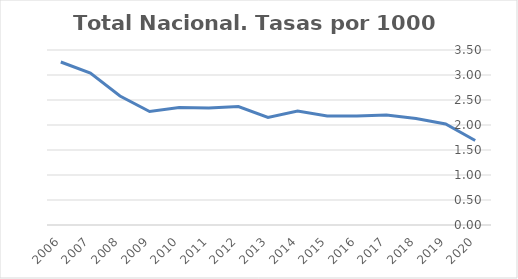
| Category | Total Nacional |
|---|---|
| 2020 | 1.69 |
| 2019 | 2.02 |
| 2018 | 2.13 |
| 2017 | 2.2 |
| 2016 | 2.18 |
| 2015 | 2.18 |
| 2014 | 2.28 |
| 2013 | 2.15 |
| 2012 | 2.37 |
| 2011 | 2.34 |
| 2010 | 2.35 |
| 2009 | 2.27 |
| 2008 | 2.58 |
| 2007 | 3.04 |
| 2006 | 3.26 |